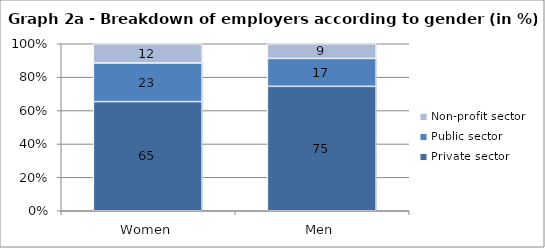
| Category | Private sector | Public sector | Non-profit sector |
|---|---|---|---|
| Women | 65.38 | 23.11 | 11.51 |
| Men | 74.5 | 16.72 | 8.78 |